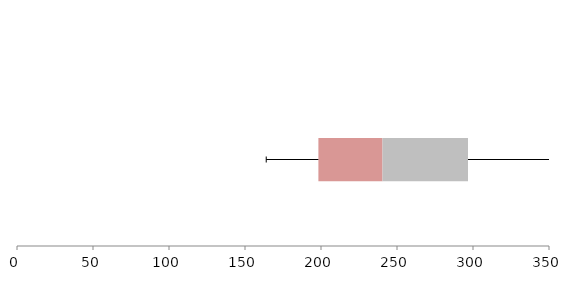
| Category | Series 1 | Series 2 | Series 3 |
|---|---|---|---|
| 0 | 198.288 | 42.165 | 56.258 |